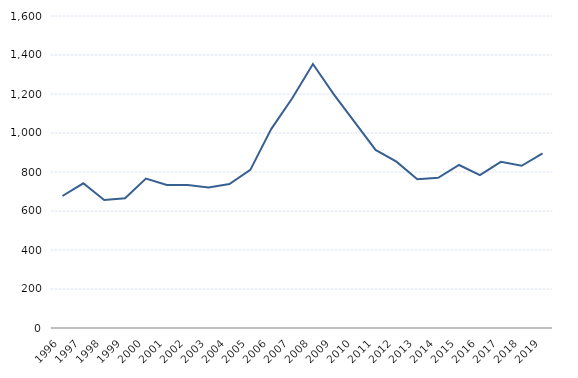
| Category | Series 1 |
|---|---|
| 1996.0 | 677 |
| 1997.0 | 742 |
| 1998.0 | 656 |
| 1999.0 | 665 |
| 2000.0 | 766 |
| 2001.0 | 733 |
| 2002.0 | 733 |
| 2003.0 | 721 |
| 2004.0 | 738 |
| 2005.0 | 811 |
| 2006.0 | 1020 |
| 2007.0 | 1177 |
| 2008.0 | 1354 |
| 2009.0 | 1198 |
| 2010.0 | 1056 |
| 2011.0 | 913 |
| 2012.0 | 853 |
| 2013.0 | 763 |
| 2014.0 | 770 |
| 2015.0 | 836 |
| 2016.0 | 784 |
| 2017.0 | 852 |
| 2018.0 | 832 |
| 2019.0 | 895 |